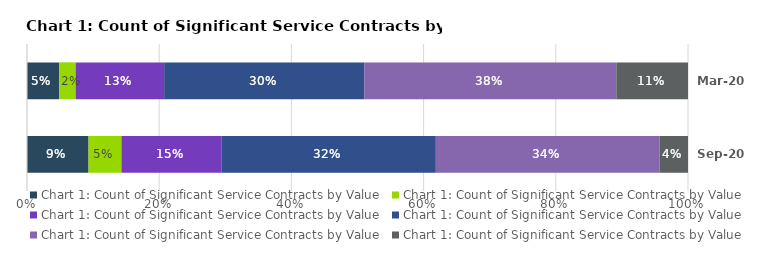
| Category | $0 - $5000 | $5,000 - $100,000 | $100,000 - $1 (M) | $1 (M)-$10 (M) | $10 (M) -$100 (M) | $100 (M) -$1,100 (M) |
|---|---|---|---|---|---|---|
| Mar-20 (415) | 0.049 | 0.025 | 0.134 | 0.303 | 0.381 | 0.108 |
| Sep-20 (608) | 0.093 | 0.05 | 0.152 | 0.324 | 0.339 | 0.043 |